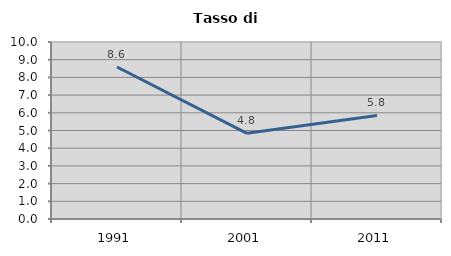
| Category | Tasso di disoccupazione   |
|---|---|
| 1991.0 | 8.586 |
| 2001.0 | 4.84 |
| 2011.0 | 5.85 |